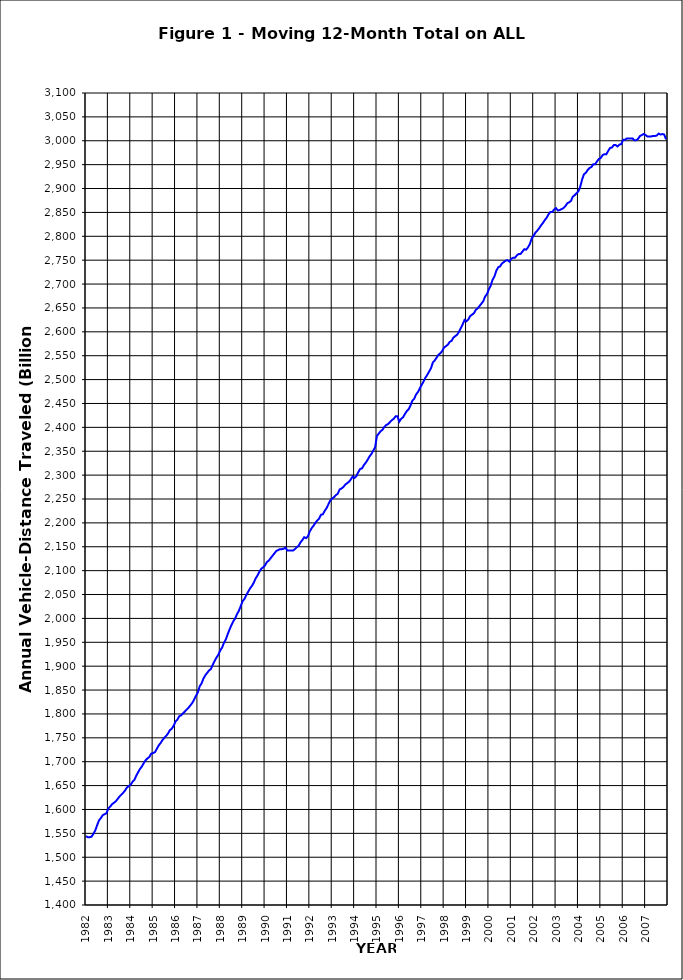
| Category | Annual Vehicle-Distance Traveled (Billion Miles) |
|---|---|
| 1982-01-01 | 1544 |
| 1982-02-01 | 1542 |
| 1982-03-01 | 1542 |
| 1982-04-01 | 1543 |
| 1982-05-01 | 1549 |
| 1982-06-01 | 1556 |
| 1982-07-01 | 1567 |
| 1982-08-01 | 1577 |
| 1982-09-01 | 1582 |
| 1982-10-01 | 1588 |
| 1982-11-01 | 1590 |
| 1982-12-01 | 1592 |
| 1983-01-01 | 1602 |
| 1983-02-01 | 1606 |
| 1983-03-01 | 1611 |
| 1983-04-01 | 1614 |
| 1983-05-01 | 1617 |
| 1983-06-01 | 1622 |
| 1983-07-01 | 1627 |
| 1983-08-01 | 1631 |
| 1983-09-01 | 1635 |
| 1983-10-01 | 1640 |
| 1983-11-01 | 1646 |
| 1983-12-01 | 1649 |
| 1984-01-01 | 1652 |
| 1984-02-01 | 1658 |
| 1984-03-01 | 1662 |
| 1984-04-01 | 1671 |
| 1984-05-01 | 1678 |
| 1984-06-01 | 1685 |
| 1984-07-01 | 1690 |
| 1984-08-01 | 1697 |
| 1984-09-01 | 1703 |
| 1984-10-01 | 1707 |
| 1984-11-01 | 1710 |
| 1984-12-01 | 1717 |
| 1985-01-01 | 1718 |
| 1985-02-01 | 1720 |
| 1985-03-01 | 1727 |
| 1985-04-01 | 1734 |
| 1985-05-01 | 1739 |
| 1985-06-01 | 1745 |
| 1985-07-01 | 1750 |
| 1985-08-01 | 1754 |
| 1985-09-01 | 1759 |
| 1985-10-01 | 1766 |
| 1985-11-01 | 1769 |
| 1985-12-01 | 1775 |
| 1986-01-01 | 1784 |
| 1986-02-01 | 1788 |
| 1986-03-01 | 1795 |
| 1986-04-01 | 1797 |
| 1986-05-01 | 1801 |
| 1986-06-01 | 1805 |
| 1986-07-01 | 1809 |
| 1986-08-01 | 1813 |
| 1986-09-01 | 1818 |
| 1986-10-01 | 1823 |
| 1986-11-01 | 1830 |
| 1986-12-01 | 1838 |
| 1987-01-01 | 1845 |
| 1987-02-01 | 1858 |
| 1987-03-01 | 1864 |
| 1987-04-01 | 1874 |
| 1987-05-01 | 1881 |
| 1987-06-01 | 1886 |
| 1987-07-01 | 1891 |
| 1987-08-01 | 1894 |
| 1987-09-01 | 1903 |
| 1987-10-01 | 1911 |
| 1987-11-01 | 1918 |
| 1987-12-01 | 1924 |
| 1988-01-01 | 1933 |
| 1988-02-01 | 1939 |
| 1988-03-01 | 1949 |
| 1988-04-01 | 1956 |
| 1988-05-01 | 1967 |
| 1988-06-01 | 1977 |
| 1988-07-01 | 1986 |
| 1988-08-01 | 1994 |
| 1988-09-01 | 2000 |
| 1988-10-01 | 2009 |
| 1988-11-01 | 2016 |
| 1988-12-01 | 2026 |
| 1989-01-01 | 2036 |
| 1989-02-01 | 2041 |
| 1989-03-01 | 2049 |
| 1989-04-01 | 2056 |
| 1989-05-01 | 2063 |
| 1989-06-01 | 2068 |
| 1989-07-01 | 2075 |
| 1989-08-01 | 2084 |
| 1989-09-01 | 2090 |
| 1989-10-01 | 2098 |
| 1989-11-01 | 2104 |
| 1989-12-01 | 2107 |
| 1990-01-01 | 2111 |
| 1990-02-01 | 2118 |
| 1990-03-01 | 2121 |
| 1990-04-01 | 2126 |
| 1990-05-01 | 2131 |
| 1990-06-01 | 2136 |
| 1990-07-01 | 2141 |
| 1990-08-01 | 2143 |
| 1990-09-01 | 2145 |
| 1990-10-01 | 2145 |
| 1990-11-01 | 2146 |
| 1990-12-01 | 2148 |
| 1991-01-01 | 2142 |
| 1991-02-01 | 2142 |
| 1991-03-01 | 2142 |
| 1991-04-01 | 2142 |
| 1991-05-01 | 2145 |
| 1991-06-01 | 2149 |
| 1991-07-01 | 2152 |
| 1991-08-01 | 2159 |
| 1991-09-01 | 2164 |
| 1991-10-01 | 2170 |
| 1991-11-01 | 2168 |
| 1991-12-01 | 2172 |
| 1992-01-01 | 2182 |
| 1992-02-01 | 2189 |
| 1992-03-01 | 2194 |
| 1992-04-01 | 2200 |
| 1992-05-01 | 2205 |
| 1992-06-01 | 2209 |
| 1992-07-01 | 2217 |
| 1992-08-01 | 2218 |
| 1992-09-01 | 2225 |
| 1992-10-01 | 2231 |
| 1992-11-01 | 2239 |
| 1992-12-01 | 2247 |
| 1993-01-01 | 2251 |
| 1993-02-01 | 2254 |
| 1993-03-01 | 2258 |
| 1993-04-01 | 2261 |
| 1993-05-01 | 2270 |
| 1993-06-01 | 2272 |
| 1993-07-01 | 2275 |
| 1993-08-01 | 2280 |
| 1993-09-01 | 2283 |
| 1993-10-01 | 2286 |
| 1993-11-01 | 2291 |
| 1993-12-01 | 2297 |
| 1994-01-01 | 2294 |
| 1994-02-01 | 2298 |
| 1994-03-01 | 2306 |
| 1994-04-01 | 2313 |
| 1994-05-01 | 2314 |
| 1994-06-01 | 2321 |
| 1994-07-01 | 2326 |
| 1994-08-01 | 2332 |
| 1994-09-01 | 2339 |
| 1994-10-01 | 2344 |
| 1994-11-01 | 2351 |
| 1994-12-01 | 2358 |
| 1995-01-01 | 2382 |
| 1995-02-01 | 2387 |
| 1995-03-01 | 2392 |
| 1995-04-01 | 2395 |
| 1995-05-01 | 2401 |
| 1995-06-01 | 2405 |
| 1995-07-01 | 2407 |
| 1995-08-01 | 2411 |
| 1995-09-01 | 2415 |
| 1995-10-01 | 2418 |
| 1995-11-01 | 2423 |
| 1995-12-01 | 2423 |
| 1996-01-01 | 2412 |
| 1996-02-01 | 2418 |
| 1996-03-01 | 2421 |
| 1996-04-01 | 2428 |
| 1996-05-01 | 2434 |
| 1996-06-01 | 2438 |
| 1996-07-01 | 2446 |
| 1996-08-01 | 2456 |
| 1996-09-01 | 2460 |
| 1996-10-01 | 2469 |
| 1996-11-01 | 2474 |
| 1996-12-01 | 2482 |
| 1997-01-01 | 2489 |
| 1997-02-01 | 2496 |
| 1997-03-01 | 2504 |
| 1997-04-01 | 2510 |
| 1997-05-01 | 2517 |
| 1997-06-01 | 2524 |
| 1997-07-01 | 2536 |
| 1997-08-01 | 2540 |
| 1997-09-01 | 2546 |
| 1997-10-01 | 2552 |
| 1997-11-01 | 2555 |
| 1997-12-01 | 2560 |
| 1998-01-01 | 2567 |
| 1998-02-01 | 2570 |
| 1998-03-01 | 2573 |
| 1998-04-01 | 2579 |
| 1998-05-01 | 2581 |
| 1998-06-01 | 2588 |
| 1998-07-01 | 2591 |
| 1998-08-01 | 2594 |
| 1998-09-01 | 2600 |
| 1998-10-01 | 2608 |
| 1998-11-01 | 2616 |
| 1998-12-01 | 2625 |
| 1999-01-01 | 2622 |
| 1999-02-01 | 2626 |
| 1999-03-01 | 2633 |
| 1999-04-01 | 2636 |
| 1999-05-01 | 2639 |
| 1999-06-01 | 2646 |
| 1999-07-01 | 2649 |
| 1999-08-01 | 2654 |
| 1999-09-01 | 2659 |
| 1999-10-01 | 2664 |
| 1999-11-01 | 2674 |
| 1999-12-01 | 2679 |
| 2000-01-01 | 2689 |
| 2000-02-01 | 2697 |
| 2000-03-01 | 2709 |
| 2000-04-01 | 2716 |
| 2000-05-01 | 2728 |
| 2000-06-01 | 2735 |
| 2000-07-01 | 2737 |
| 2000-08-01 | 2743 |
| 2000-09-01 | 2746 |
| 2000-10-01 | 2749 |
| 2000-11-01 | 2750 |
| 2000-12-01 | 2747 |
| 2001-01-01 | 2753 |
| 2001-02-01 | 2755 |
| 2001-03-01 | 2755 |
| 2001-04-01 | 2760 |
| 2001-05-01 | 2763 |
| 2001-06-01 | 2763 |
| 2001-07-01 | 2768 |
| 2001-08-01 | 2773 |
| 2001-09-01 | 2772 |
| 2001-10-01 | 2777 |
| 2001-11-01 | 2784 |
| 2001-12-01 | 2796 |
| 2002-01-01 | 2801 |
| 2002-02-01 | 2808 |
| 2002-03-01 | 2812 |
| 2002-04-01 | 2817 |
| 2002-05-01 | 2823 |
| 2002-06-01 | 2828 |
| 2002-07-01 | 2834 |
| 2002-08-01 | 2839 |
| 2002-09-01 | 2846 |
| 2002-10-01 | 2851 |
| 2002-11-01 | 2851 |
| 2002-12-01 | 2856 |
| 2003-01-01 | 2859 |
| 2003-02-01 | 2854 |
| 2003-03-01 | 2855 |
| 2003-04-01 | 2857 |
| 2003-05-01 | 2859 |
| 2003-06-01 | 2863 |
| 2003-07-01 | 2869 |
| 2003-08-01 | 2871 |
| 2003-09-01 | 2874 |
| 2003-10-01 | 2883 |
| 2003-11-01 | 2886 |
| 2003-12-01 | 2890 |
| 2004-01-01 | 2894 |
| 2004-02-01 | 2904 |
| 2004-03-01 | 2919 |
| 2004-04-01 | 2930 |
| 2004-05-01 | 2933 |
| 2004-06-01 | 2939 |
| 2004-07-01 | 2943 |
| 2004-08-01 | 2945 |
| 2004-09-01 | 2951 |
| 2004-10-01 | 2951 |
| 2004-11-01 | 2957 |
| 2004-12-01 | 2962 |
| 2005-01-01 | 2964 |
| 2005-02-01 | 2970 |
| 2005-03-01 | 2972 |
| 2005-04-01 | 2972 |
| 2005-05-01 | 2979 |
| 2005-06-01 | 2985 |
| 2005-07-01 | 2986 |
| 2005-08-01 | 2991 |
| 2005-09-01 | 2991 |
| 2005-10-01 | 2988 |
| 2005-11-01 | 2992 |
| 2005-12-01 | 2993 |
| 2006-01-01 | 3002 |
| 2006-02-01 | 3002 |
| 2006-03-01 | 3005 |
| 2006-04-01 | 3005 |
| 2006-05-01 | 3005 |
| 2006-06-01 | 3005 |
| 2006-07-01 | 3001 |
| 2006-08-01 | 3001 |
| 2006-09-01 | 3004 |
| 2006-10-01 | 3010 |
| 2006-11-01 | 3012 |
| 2006-12-01 | 3014 |
| 2007-01-01 | 3012 |
| 2007-02-01 | 3009 |
| 2007-03-01 | 3009 |
| 2007-04-01 | 3009 |
| 2007-05-01 | 3010 |
| 2007-06-01 | 3010 |
| 2007-07-01 | 3011 |
| 2007-08-01 | 3015 |
| 2007-09-01 | 3013 |
| 2007-10-01 | 3014 |
| 2007-11-01 | 3013 |
| 2007-12-01 | 3003 |